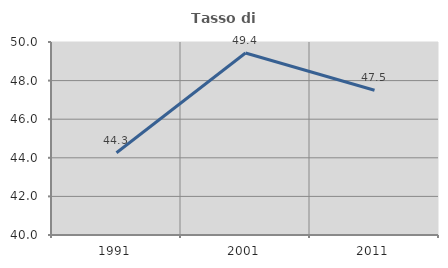
| Category | Tasso di occupazione   |
|---|---|
| 1991.0 | 44.262 |
| 2001.0 | 49.428 |
| 2011.0 | 47.503 |